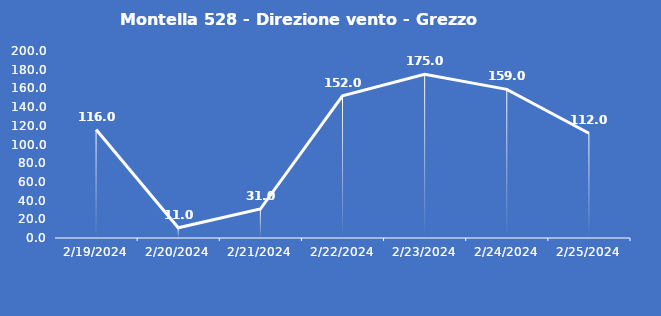
| Category | Montella 528 - Direzione vento - Grezzo (°N) |
|---|---|
| 2/19/24 | 116 |
| 2/20/24 | 11 |
| 2/21/24 | 31 |
| 2/22/24 | 152 |
| 2/23/24 | 175 |
| 2/24/24 | 159 |
| 2/25/24 | 112 |